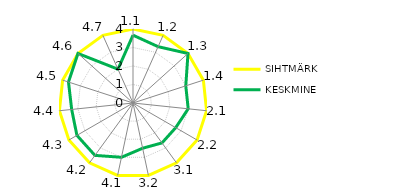
| Category | SIHTMÄRK | KESKMINE |
|---|---|---|
| 1.1 | 4 | 3.667 |
| 1.2 | 4 | 3.333 |
| 1.3 | 4 | 4 |
| 1.4 | 4 | 3 |
| 2.1 | 4 | 3 |
| 2.2 | 4 | 2.667 |
| 3.1 | 4 | 2.667 |
| 3.2 | 4 | 2.5 |
| 4.1 | 4 | 3 |
| 4.2 | 4 | 3.5 |
| 4.3 | 4 | 3.5 |
| 4.4 | 4 | 3.333 |
| 4.5 | 4 | 3.667 |
| 4.6 | 4 | 4 |
| 4.7 | 4 | 2 |